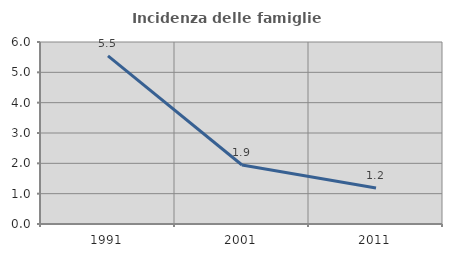
| Category | Incidenza delle famiglie numerose |
|---|---|
| 1991.0 | 5.541 |
| 2001.0 | 1.944 |
| 2011.0 | 1.185 |